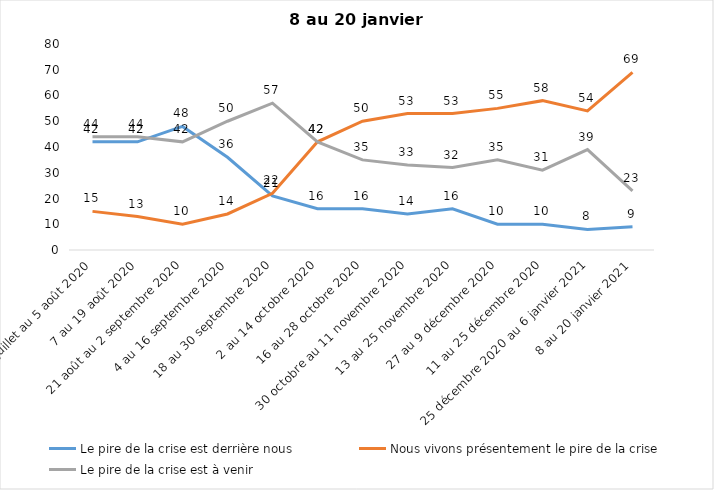
| Category | Le pire de la crise est derrière nous | Nous vivons présentement le pire de la crise | Le pire de la crise est à venir |
|---|---|---|---|
| 24 juillet au 5 août 2020 | 42 | 15 | 44 |
| 7 au 19 août 2020 | 42 | 13 | 44 |
| 21 août au 2 septembre 2020 | 48 | 10 | 42 |
| 4 au 16 septembre 2020 | 36 | 14 | 50 |
| 18 au 30 septembre 2020 | 21 | 22 | 57 |
| 2 au 14 octobre 2020 | 16 | 42 | 42 |
| 16 au 28 octobre 2020 | 16 | 50 | 35 |
| 30 octobre au 11 novembre 2020 | 14 | 53 | 33 |
| 13 au 25 novembre 2020 | 16 | 53 | 32 |
| 27 au 9 décembre 2020 | 10 | 55 | 35 |
| 11 au 25 décembre 2020 | 10 | 58 | 31 |
| 25 décembre 2020 au 6 janvier 2021 | 8 | 54 | 39 |
| 8 au 20 janvier 2021 | 9 | 69 | 23 |